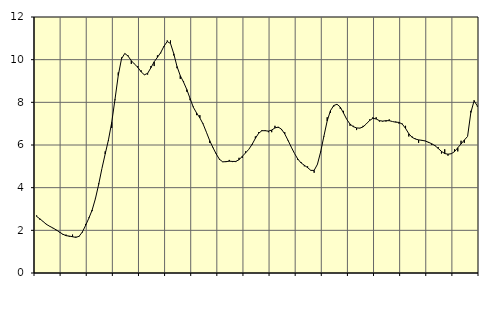
| Category | Piggar | Series 1 |
|---|---|---|
| nan | 2.7 | 2.65 |
| 87.0 | 2.5 | 2.54 |
| 87.0 | 2.4 | 2.41 |
| 87.0 | 2.3 | 2.28 |
| nan | 2.2 | 2.19 |
| 88.0 | 2.1 | 2.11 |
| 88.0 | 2 | 2.02 |
| 88.0 | 1.9 | 1.92 |
| nan | 1.8 | 1.82 |
| 89.0 | 1.8 | 1.75 |
| 89.0 | 1.7 | 1.73 |
| 89.0 | 1.8 | 1.7 |
| nan | 1.7 | 1.67 |
| 90.0 | 1.7 | 1.72 |
| 90.0 | 1.9 | 1.92 |
| 90.0 | 2.3 | 2.23 |
| nan | 2.6 | 2.57 |
| 91.0 | 2.9 | 2.95 |
| 91.0 | 3.5 | 3.48 |
| 91.0 | 4.2 | 4.15 |
| nan | 4.9 | 4.9 |
| 92.0 | 5.7 | 5.58 |
| 92.0 | 6.2 | 6.24 |
| 92.0 | 6.8 | 7.06 |
| nan | 8.1 | 8.14 |
| 93.0 | 9.4 | 9.26 |
| 93.0 | 10.1 | 10.04 |
| 93.0 | 10.3 | 10.29 |
| nan | 10.2 | 10.17 |
| 94.0 | 9.8 | 9.95 |
| 94.0 | 9.8 | 9.79 |
| 94.0 | 9.7 | 9.64 |
| nan | 9.5 | 9.43 |
| 95.0 | 9.3 | 9.29 |
| 95.0 | 9.3 | 9.36 |
| 95.0 | 9.7 | 9.62 |
| nan | 9.7 | 9.9 |
| 96.0 | 10.2 | 10.11 |
| 96.0 | 10.3 | 10.33 |
| 96.0 | 10.6 | 10.63 |
| nan | 10.9 | 10.85 |
| 97.0 | 10.9 | 10.76 |
| 97.0 | 10.2 | 10.28 |
| 97.0 | 9.6 | 9.68 |
| nan | 9.1 | 9.25 |
| 98.0 | 9 | 8.95 |
| 98.0 | 8.5 | 8.6 |
| 98.0 | 8.1 | 8.18 |
| nan | 7.8 | 7.77 |
| 99.0 | 7.4 | 7.5 |
| 99.0 | 7.4 | 7.27 |
| 99.0 | 7 | 6.98 |
| nan | 6.6 | 6.6 |
| 0.0 | 6.1 | 6.21 |
| 0.0 | 5.9 | 5.88 |
| 0.0 | 5.6 | 5.58 |
| nan | 5.3 | 5.33 |
| 1.0 | 5.2 | 5.21 |
| 1.0 | 5.2 | 5.22 |
| 1.0 | 5.3 | 5.24 |
| nan | 5.2 | 5.23 |
| 2.0 | 5.2 | 5.23 |
| 2.0 | 5.4 | 5.31 |
| 2.0 | 5.4 | 5.47 |
| nan | 5.7 | 5.63 |
| 3.0 | 5.8 | 5.8 |
| 3.0 | 6 | 6.03 |
| 3.0 | 6.4 | 6.31 |
| nan | 6.6 | 6.55 |
| 4.0 | 6.7 | 6.67 |
| 4.0 | 6.7 | 6.67 |
| 4.0 | 6.6 | 6.65 |
| nan | 6.6 | 6.7 |
| 5.0 | 6.9 | 6.8 |
| 5.0 | 6.8 | 6.84 |
| 5.0 | 6.7 | 6.74 |
| nan | 6.6 | 6.52 |
| 6.0 | 6.2 | 6.22 |
| 6.0 | 5.9 | 5.9 |
| 6.0 | 5.6 | 5.6 |
| nan | 5.3 | 5.34 |
| 7.0 | 5.2 | 5.16 |
| 7.0 | 5 | 5.05 |
| 7.0 | 5 | 4.94 |
| nan | 4.8 | 4.81 |
| 8.0 | 4.7 | 4.81 |
| 8.0 | 5.1 | 5.09 |
| 8.0 | 5.7 | 5.68 |
| nan | 6.4 | 6.42 |
| 9.0 | 7.3 | 7.13 |
| 9.0 | 7.5 | 7.61 |
| 9.0 | 7.8 | 7.85 |
| nan | 7.9 | 7.91 |
| 10.0 | 7.7 | 7.78 |
| 10.0 | 7.6 | 7.5 |
| 10.0 | 7.2 | 7.2 |
| nan | 6.9 | 6.98 |
| 11.0 | 6.9 | 6.86 |
| 11.0 | 6.7 | 6.8 |
| 11.0 | 6.8 | 6.79 |
| nan | 6.9 | 6.85 |
| 12.0 | 7 | 6.99 |
| 12.0 | 7.2 | 7.15 |
| 12.0 | 7.3 | 7.25 |
| nan | 7.3 | 7.22 |
| 13.0 | 7.1 | 7.14 |
| 13.0 | 7.1 | 7.12 |
| 13.0 | 7.1 | 7.14 |
| nan | 7.2 | 7.14 |
| 14.0 | 7.1 | 7.1 |
| 14.0 | 7.1 | 7.07 |
| 14.0 | 7 | 7.06 |
| nan | 7 | 6.98 |
| 15.0 | 6.9 | 6.78 |
| 15.0 | 6.4 | 6.53 |
| 15.0 | 6.4 | 6.36 |
| nan | 6.3 | 6.28 |
| 16.0 | 6.1 | 6.24 |
| 16.0 | 6.2 | 6.22 |
| 16.0 | 6.2 | 6.19 |
| nan | 6.1 | 6.13 |
| 17.0 | 6 | 6.06 |
| 17.0 | 6 | 5.97 |
| 17.0 | 5.9 | 5.84 |
| nan | 5.6 | 5.7 |
| 18.0 | 5.8 | 5.6 |
| 18.0 | 5.5 | 5.57 |
| 18.0 | 5.6 | 5.59 |
| nan | 5.8 | 5.69 |
| 19.0 | 5.7 | 5.87 |
| 19.0 | 6.2 | 6.05 |
| 19.0 | 6.1 | 6.23 |
| nan | 6.4 | 6.4 |
| 20.0 | 7.6 | 7.52 |
| 20.0 | 8.1 | 8.07 |
| 20.0 | 7.8 | 7.83 |